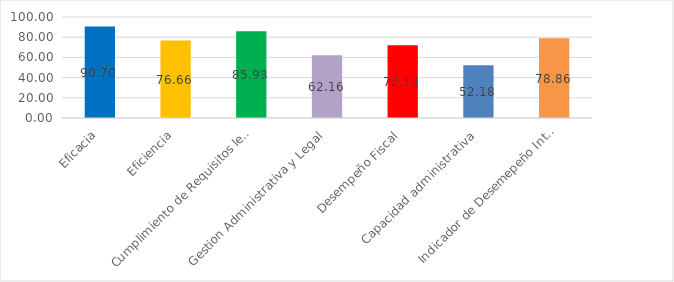
| Category | Series 0 |
|---|---|
| Eficacia | 90.7 |
| Eficiencia | 76.66 |
| Cumplimiento de Requisitos legales | 85.93 |
| Gestion Administrativa y Legal | 62.16 |
| Desempeño Fiscal | 72.13 |
| Capacidad administrativa | 52.18 |
| Indicador de Desemepeño Integral | 78.86 |